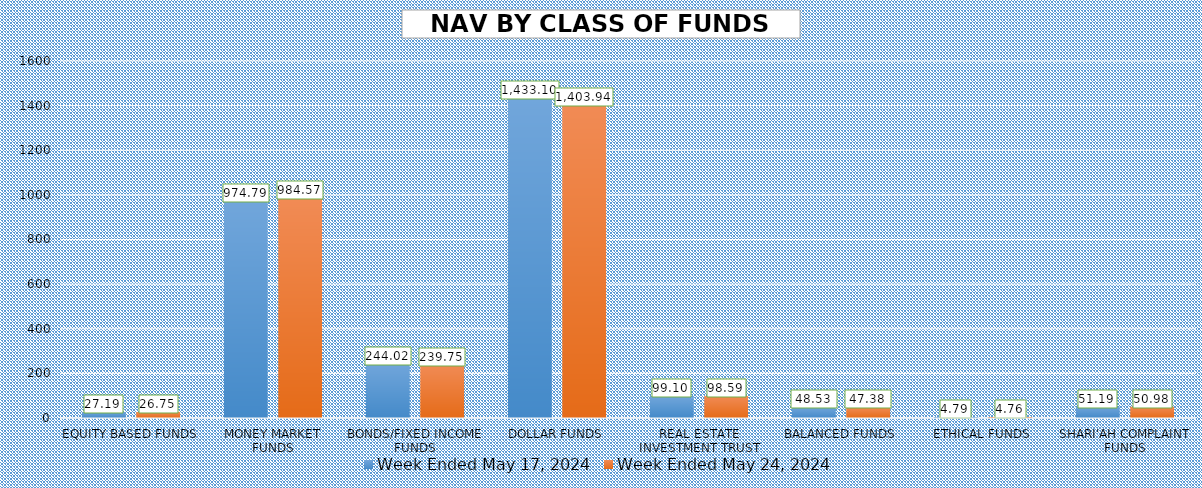
| Category | Week Ended May 17, 2024 | Week Ended May 24, 2024 |
|---|---|---|
| EQUITY BASED FUNDS | 27.188 | 26.746 |
| MONEY MARKET FUNDS | 974.789 | 984.566 |
| BONDS/FIXED INCOME FUNDS | 244.017 | 239.747 |
| DOLLAR FUNDS | 1433.1 | 1403.943 |
| REAL ESTATE INVESTMENT TRUST | 99.095 | 98.59 |
| BALANCED FUNDS | 48.528 | 47.385 |
| ETHICAL FUNDS | 4.792 | 4.763 |
| SHARI'AH COMPLAINT FUNDS | 51.188 | 50.978 |